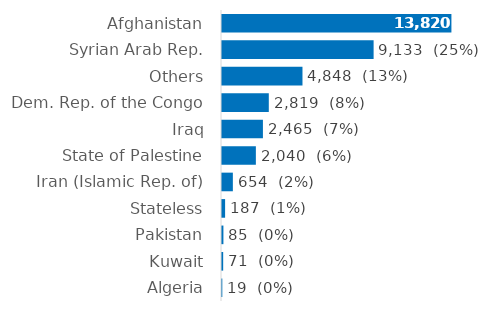
| Category | Series 0 |
|---|---|
| Afghanistan | 13820 |
| Syrian Arab Rep. | 9133 |
| Others | 4848 |
| Dem. Rep. of the Congo | 2819 |
| Iraq | 2465 |
| State of Palestine | 2040 |
| Iran (Islamic Rep. of) | 654 |
| Stateless | 187 |
| Pakistan | 85 |
| Kuwait | 71 |
| Algeria | 19 |